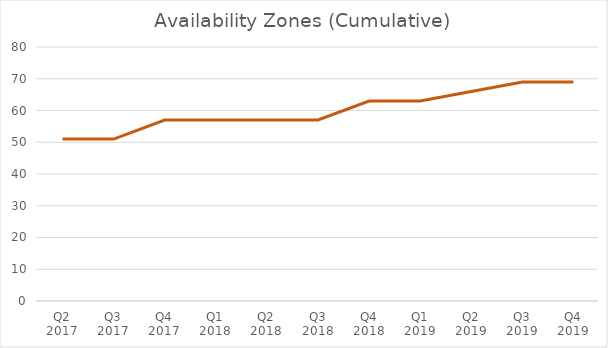
| Category | Series 0 |
|---|---|
| Q2 2017 | 51 |
| Q3 2017 | 51 |
| Q4 2017 | 57 |
| Q1 2018 | 57 |
| Q2 2018 | 57 |
| Q3 2018 | 57 |
| Q4 2018 | 63 |
| Q1 2019 | 63 |
| Q2 2019 | 66 |
| Q3 2019 | 69 |
| Q4 2019 | 69 |